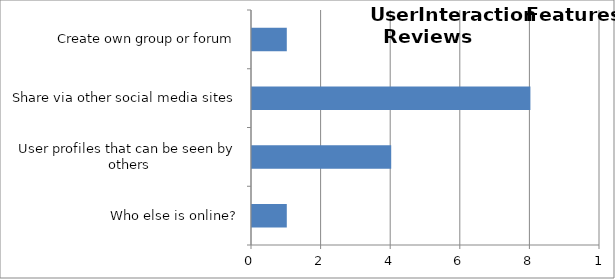
| Category | Series 0 |
|---|---|
| Who else is online? | 1 |
| User profiles that can be seen by others | 4 |
| Share via other social media sites | 8 |
| Create own group or forum | 1 |